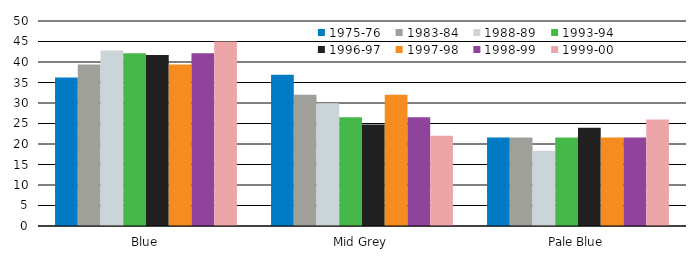
| Category | 1975-76 | 1983-84 | 1988-89 | 1993-94 | 1996-97 | 1997-98 | 1998-99 | 1999-00 |
|---|---|---|---|---|---|---|---|---|
| Blue | 36.19 | 39.39 | 42.78 | 42.13 | 41.69 | 39.39 | 42.13 | 45 |
| Mid Grey | 36.88 | 32.02 | 29.91 | 26.53 | 24.76 | 32.02 | 26.53 | 22 |
| Pale Blue | 21.56 | 21.6 | 18.35 | 21.6 | 23.98 | 21.6 | 21.6 | 26 |